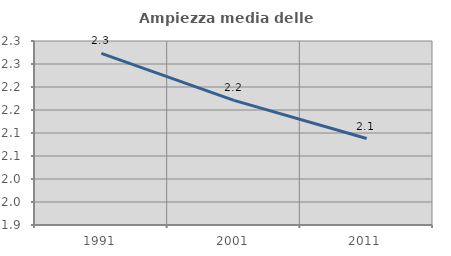
| Category | Ampiezza media delle famiglie |
|---|---|
| 1991.0 | 2.273 |
| 2001.0 | 2.171 |
| 2011.0 | 2.088 |